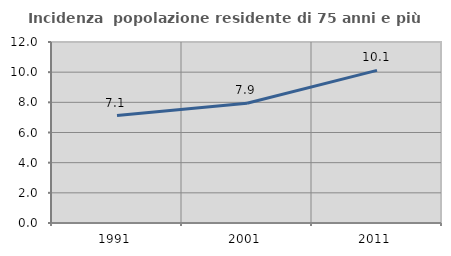
| Category | Incidenza  popolazione residente di 75 anni e più |
|---|---|
| 1991.0 | 7.12 |
| 2001.0 | 7.94 |
| 2011.0 | 10.119 |